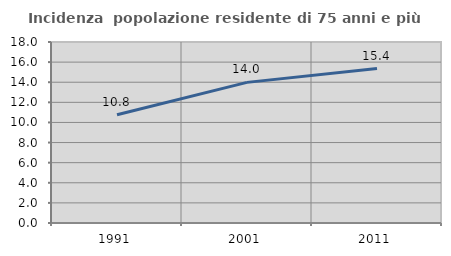
| Category | Incidenza  popolazione residente di 75 anni e più |
|---|---|
| 1991.0 | 10.771 |
| 2001.0 | 13.985 |
| 2011.0 | 15.357 |